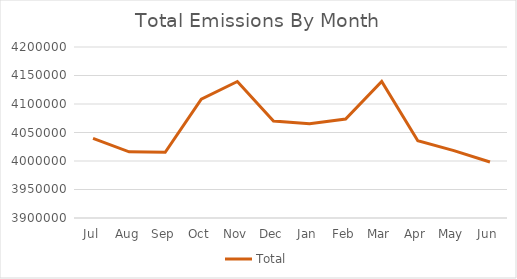
| Category | Total |
|---|---|
| Jul | 4039687.472 |
| Aug | 4016132.17 |
| Sep | 4015296.226 |
| Oct | 4108309.977 |
| Nov | 4139515.738 |
| Dec | 4070159.757 |
| Jan | 4065219.445 |
| Feb | 4073625.666 |
| Mar | 4139423.201 |
| Apr | 4035595.994 |
| May | 4018247.577 |
| Jun | 3998282.665 |